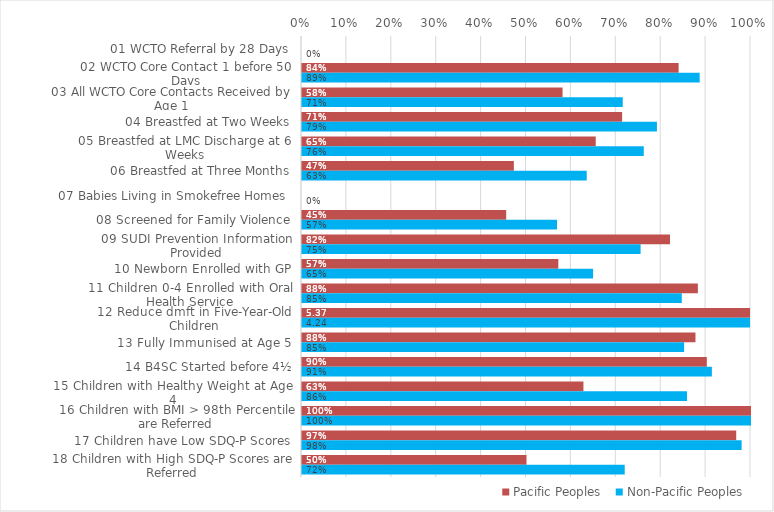
| Category | Pacific Peoples | Non-Pacific Peoples |
|---|---|---|
| 01 WCTO Referral by 28 Days | 0 | 0 |
| 02 WCTO Core Contact 1 before 50 Days | 0.839 | 0.886 |
| 03 All WCTO Core Contacts Received by Age 1 | 0.58 | 0.714 |
| 04 Breastfed at Two Weeks | 0.713 | 0.79 |
| 05 Breastfed at LMC Discharge at 6 Weeks | 0.654 | 0.761 |
| 06 Breastfed at Three Months | 0.472 | 0.634 |
| 07 Babies Living in Smokefree Homes  | 0 | 0 |
| 08 Screened for Family Violence | 0.455 | 0.568 |
| 09 SUDI Prevention Information Provided | 0.82 | 0.754 |
| 10 Newborn Enrolled with GP | 0.571 | 0.648 |
| 11 Children 0-4 Enrolled with Oral Health Service | 0.882 | 0.846 |
| 12 Reduce dmft in Five-Year-Old Children | 5.367 | 4.243 |
| 13 Fully Immunised at Age 5 | 0.876 | 0.851 |
| 14 B4SC Started before 4½ | 0.902 | 0.913 |
| 15 Children with Healthy Weight at Age 4 | 0.627 | 0.857 |
| 16 Children with BMI > 98th Percentile are Referred | 1 | 1 |
| 17 Children have Low SDQ-P Scores | 0.967 | 0.979 |
| 18 Children with High SDQ-P Scores are Referred | 0.5 | 0.719 |